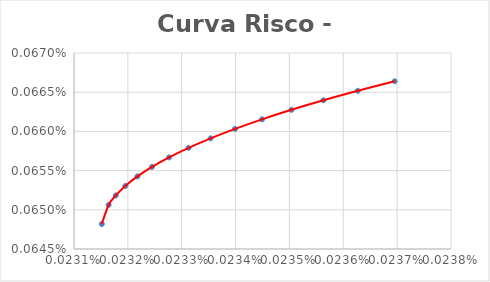
| Category | Series 0 |
|---|---|
| 0.0002315160759656851 | 0.001 |
| 0.00023164270328256532 | 0.001 |
| 0.0002317750707248161 | 0.001 |
| 0.00023195347402294068 | 0.001 |
| 0.00023217791317693904 | 0.001 |
| 0.00023244838818681113 | 0.001 |
| 0.00023276489905255703 | 0.001 |
| 0.00023312744577417668 | 0.001 |
| 0.00023353602835167011 | 0.001 |
| 0.00023399064678503734 | 0.001 |
| 0.00023449130107427836 | 0.001 |
| 0.00023503799121939314 | 0.001 |
| 0.0002356307172203817 | 0.001 |
| 0.00023626947907724405 | 0.001 |
| 0.00023695427678998012 | 0.001 |